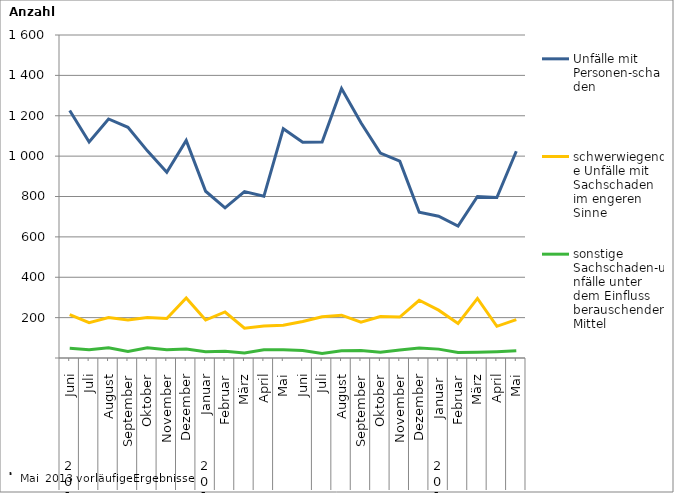
| Category | Unfälle mit Personen-schaden | schwerwiegende Unfälle mit Sachschaden   im engeren Sinne | sonstige Sachschaden-unfälle unter dem Einfluss berauschender Mittel |
|---|---|---|---|
| 0 | 1226 | 215 | 48 |
| 1 | 1070 | 175 | 41 |
| 2 | 1184 | 200 | 51 |
| 3 | 1143 | 188 | 32 |
| 4 | 1026 | 200 | 51 |
| 5 | 920 | 196 | 41 |
| 6 | 1078 | 297 | 45 |
| 7 | 826 | 188 | 31 |
| 8 | 744 | 228 | 34 |
| 9 | 824 | 148 | 25 |
| 10 | 801 | 159 | 41 |
| 11 | 1136 | 162 | 41 |
| 12 | 1069 | 181 | 37 |
| 13 | 1070 | 204 | 22 |
| 14 | 1335 | 212 | 36 |
| 15 | 1165 | 177 | 37 |
| 16 | 1015 | 205 | 28 |
| 17 | 975 | 203 | 40 |
| 18 | 722 | 286 | 50 |
| 19 | 702 | 237 | 44 |
| 20 | 653 | 171 | 27 |
| 21 | 800 | 295 | 28 |
| 22 | 795 | 157 | 31 |
| 23 | 1024 | 190 | 36 |